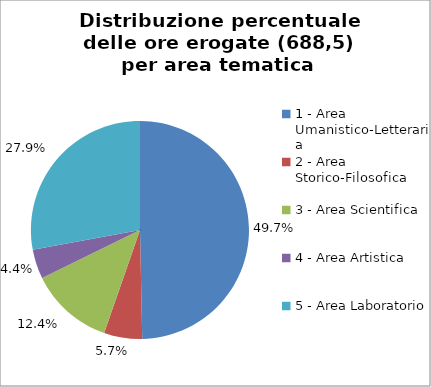
| Category | Nr. Ore Erogate |
|---|---|
| 1 - Area Umanistico-Letteraria | 342 |
| 2 - Area Storico-Filosofica | 39 |
| 3 - Area Scientifica | 85.5 |
| 4 - Area Artistica | 30 |
| 5 - Area Laboratorio | 192 |